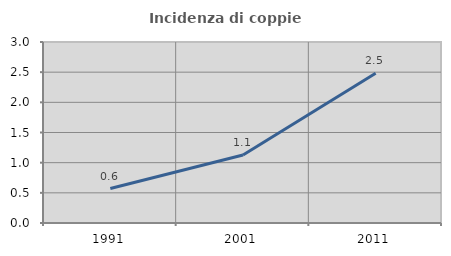
| Category | Incidenza di coppie miste |
|---|---|
| 1991.0 | 0.571 |
| 2001.0 | 1.127 |
| 2011.0 | 2.482 |